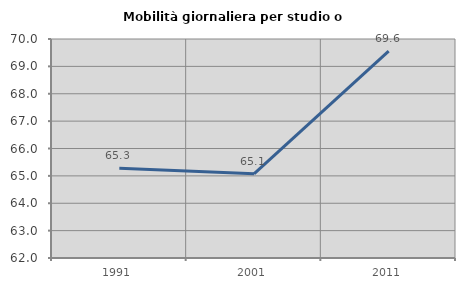
| Category | Mobilità giornaliera per studio o lavoro |
|---|---|
| 1991.0 | 65.277 |
| 2001.0 | 65.076 |
| 2011.0 | 69.558 |